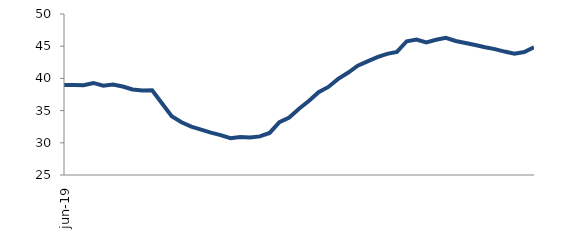
| Category | Series 0 |
|---|---|
| 2019-06-01 | 38.994 |
| 2019-07-01 | 38.99 |
| 2019-08-01 | 38.936 |
| 2019-09-01 | 39.294 |
| 2019-10-01 | 38.876 |
| 2019-11-01 | 39.061 |
| 2019-12-01 | 38.744 |
| 2020-01-01 | 38.288 |
| 2020-02-01 | 38.128 |
| 2020-03-01 | 38.143 |
| 2020-04-01 | 36.141 |
| 2020-05-01 | 34.114 |
| 2020-06-01 | 33.191 |
| 2020-07-01 | 32.506 |
| 2020-08-01 | 32.045 |
| 2020-09-01 | 31.572 |
| 2020-10-01 | 31.184 |
| 2020-11-01 | 30.726 |
| 2020-12-01 | 30.899 |
| 2021-01-01 | 30.834 |
| 2021-02-01 | 30.995 |
| 2021-03-01 | 31.535 |
| 2021-04-01 | 33.22 |
| 2021-05-01 | 33.912 |
| 2021-06-01 | 35.282 |
| 2021-07-01 | 36.501 |
| 2021-08-01 | 37.863 |
| 2021-09-01 | 38.674 |
| 2021-10-01 | 39.929 |
| 2021-11-01 | 40.877 |
| 2021-12-01 | 41.971 |
| 2022-01-01 | 42.648 |
| 2022-02-01 | 43.291 |
| 2022-03-01 | 43.809 |
| 2022-04-01 | 44.109 |
| 2022-05-01 | 45.766 |
| 2022-06-01 | 46.018 |
| 2022-07-01 | 45.603 |
| 2022-08-01 | 45.994 |
| 2022-09-01 | 46.295 |
| 2022-10-01 | 45.815 |
| 2022-11-01 | 45.487 |
| 2022-12-01 | 45.174 |
| 2023-01-01 | 44.844 |
| 2023-02-01 | 44.552 |
| 2023-03-01 | 44.166 |
| 2023-04-01 | 43.838 |
| 2023-05-01 | 44.095 |
| 2023-06-01 | 44.849 |